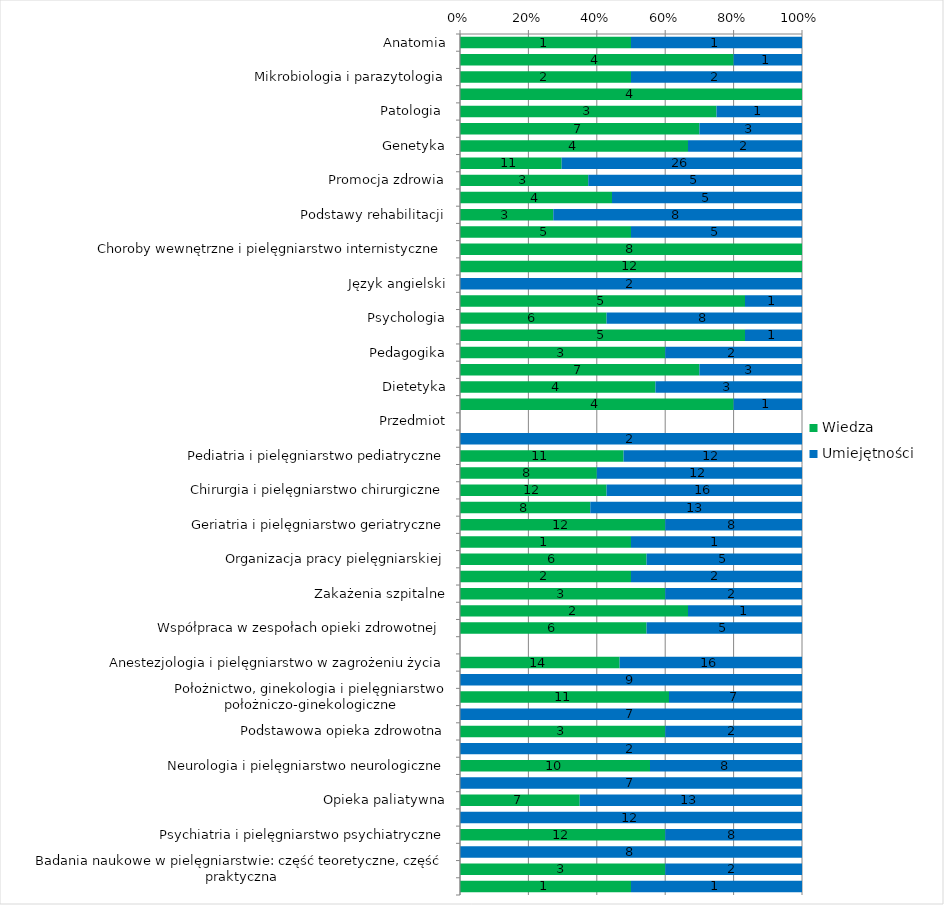
| Category | Wiedza | Umiejętności |
|---|---|---|
| Anatomia | 1 | 1 |
| Biochemia i biofizyka | 4 | 1 |
| Mikrobiologia i parazytologia | 2 | 2 |
| Fizjologia | 4 | 0 |
| Patologia  | 3 | 1 |
| Farmakologia | 7 | 3 |
| Genetyka | 4 | 2 |
| Podstawy pielęgniarstwa | 11 | 26 |
| Promocja zdrowia | 3 | 5 |
| Badanie fizykalne | 4 | 5 |
| Podstawy rehabilitacji | 3 | 8 |
| Podstawy ratownictwa medycznego | 5 | 5 |
| Choroby wewnętrzne i pielęgniarstwo internistyczne | 8 | 0 |
| Chirurgia i pielęgniarstwo chirurgiczne | 12 | 0 |
| Język angielski | 0 | 2 |
| Prawo medyczne | 5 | 1 |
| Psychologia | 6 | 8 |
| Socjologia | 5 | 1 |
| Pedagogika | 3 | 2 |
| Zdrowie Publiczne | 7 | 3 |
| Dietetyka | 4 | 3 |
| Etyka zawodu pielęgniarki | 4 | 1 |
| Przedmiot | 0 | 0 |
| Język angielski | 0 | 2 |
| Pediatria i pielęgniarstwo pediatryczne | 11 | 12 |
| Choroby wewnętrzne i pielęgniarstwo internistyczne | 8 | 12 |
| Chirurgia i pielęgniarstwo chirurgiczne | 12 | 16 |
| Pielęgniarstwo opieki długoterminowej | 8 | 13 |
| Geriatria i pielęgniarstwo geriatryczne | 12 | 8 |
| Radiologia | 1 | 1 |
| Organizacja pracy pielęgniarskiej | 6 | 5 |
| System informacji w ochronie zdrowia | 2 | 2 |
| Zakażenia szpitalne | 3 | 2 |
| Język migowy | 2 | 1 |
| Współpraca w zespołach opieki zdrowotnej  | 6 | 5 |
| Przedmiot | 0 | 0 |
| Anestezjologia i pielęgniarstwo w zagrożeniu życia | 14 | 16 |
| Anestezjologia i pielęgniarstwo w zagrożeniu życia - praktyka zawodowa | 0 | 9 |
| Położnictwo, ginekologia i pielęgniarstwo położniczo-ginekologiczne | 11 | 7 |
| Położnictwo, ginekologia i pielęgniarstwo położniczo-ginekologiczne - praktyka zawodowa | 0 | 7 |
| Podstawowa opieka zdrowotna | 3 | 2 |
| Podstawowa opieka zdrowotna - praktyka zawodowa | 0 | 2 |
| Neurologia i pielęgniarstwo neurologiczne | 10 | 8 |
| Neurologia i pielęgniarstwo neurologiczne - praktyka zawodowa | 0 | 7 |
| Opieka paliatywna | 7 | 13 |
| Opieka paliatywna - praktyka zawodowa | 0 | 12 |
| Psychiatria i pielęgniarstwo psychiatryczne | 12 | 8 |
| Psychiatria i pielęgniarstwo psychiatryczne - praktyka zawodowa | 0 | 8 |
| Badania naukowe w pielęgniarstwie: część teoretyczne, część praktyczna | 3 | 2 |
| Seminarium dyplomowe | 1 | 1 |